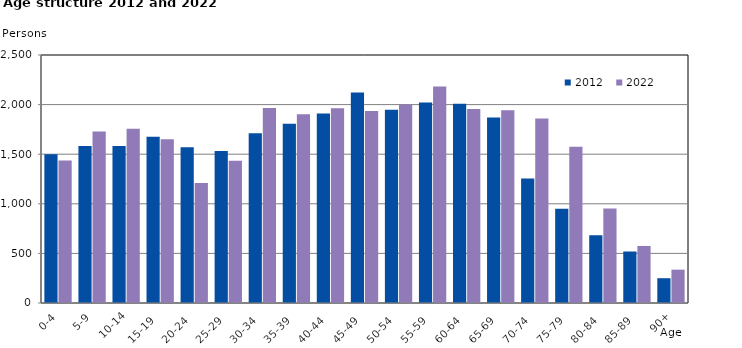
| Category | 2012 | 2022 |
|---|---|---|
|   0-4  | 1500 | 1437 |
|   5-9  | 1583 | 1728 |
| 10-14 | 1582 | 1756 |
| 15-19  | 1676 | 1650 |
| 20-24  | 1570 | 1209 |
| 25-29  | 1533 | 1435 |
| 30-34  | 1712 | 1965 |
| 35-39  | 1807 | 1902 |
| 40-44  | 1910 | 1962 |
| 45-49  | 2123 | 1936 |
| 50-54  | 1949 | 2000 |
| 55-59  | 2022 | 2183 |
| 60-64  | 2008 | 1956 |
| 65-69  | 1870 | 1943 |
| 70-74  | 1255 | 1860 |
| 75-79  | 951 | 1574 |
| 80-84  | 682 | 952 |
| 85-89  | 519 | 575 |
| 90+ | 250 | 336 |